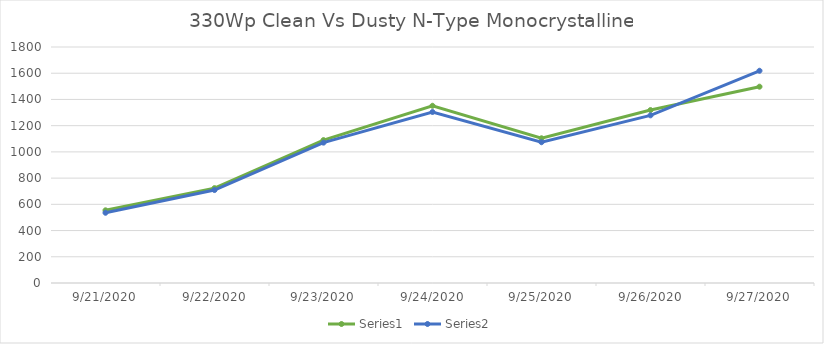
| Category | Series 0 | Series 1 |
|---|---|---|
| 9/21/20 | 554.25 | 535.75 |
| 9/22/20 | 723.75 | 709 |
| 9/23/20 | 1090 | 1070.5 |
| 9/24/20 | 1351.75 | 1304.25 |
| 9/25/20 | 1103.75 | 1073.75 |
| 9/26/20 | 1319 | 1278.75 |
| 9/27/20 | 1497.25 | 1618.75 |